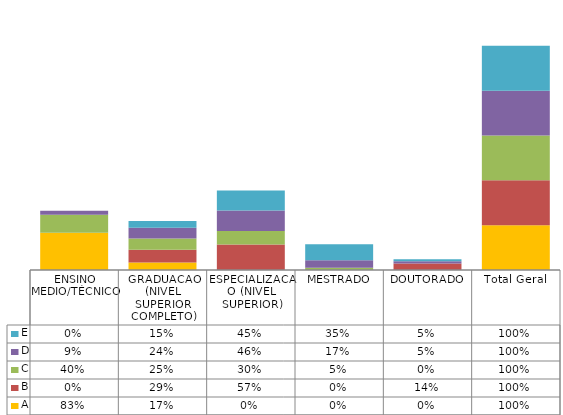
| Category | A | B | C | D | E |
|---|---|---|---|---|---|
| ENSINO MEDIO/TÉCNICO | 0.833 | 0 | 0.4 | 0.088 | 0 |
| GRADUACAO (NIVEL SUPERIOR COMPLETO) | 0.167 | 0.286 | 0.25 | 0.237 | 0.152 |
| ESPECIALIZACAO (NIVEL SUPERIOR) | 0 | 0.571 | 0.3 | 0.457 | 0.445 |
| MESTRADO | 0 | 0 | 0.05 | 0.167 | 0.355 |
| DOUTORADO | 0 | 0.143 | 0 | 0.05 | 0.048 |
| Total Geral | 1 | 1 | 1 | 1 | 1 |